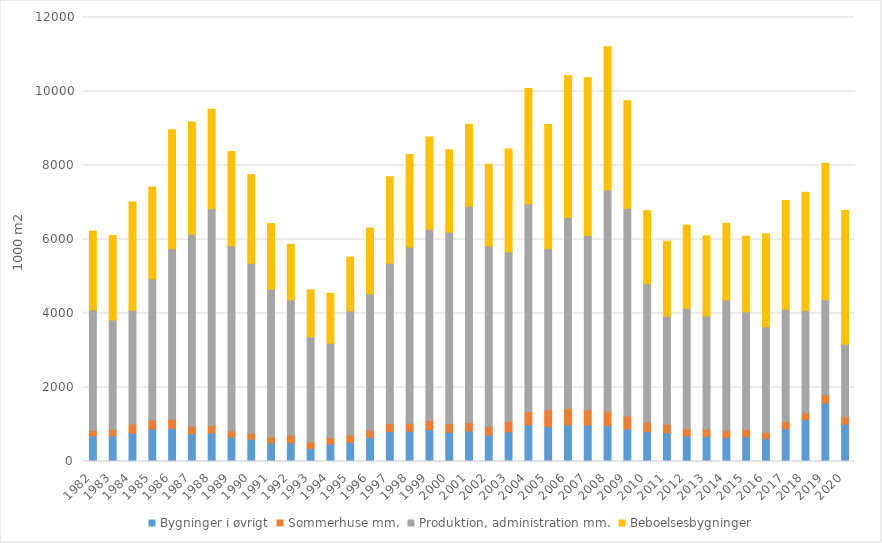
| Category | Bygninger i øvrigt | Sommerhuse mm. | Produktion, administration mm. | Beboelsesbygninger |
|---|---|---|---|---|
| 1982 | 689.438 | 156.497 | 3254.617 | 2129.288 |
| 1983 | 690.079 | 168.269 | 2964.675 | 2286.894 |
| 1984 | 768.984 | 247.712 | 3073.718 | 2922.97 |
| 1985 | 881.294 | 240.256 | 3811.789 | 2483.391 |
| 1986 | 891.343 | 250.771 | 4605.788 | 3218.41 |
| 1987 | 751.987 | 199.505 | 5189.478 | 3031.841 |
| 1988 | 770.067 | 206.254 | 5852.876 | 2693.13 |
| 1989 | 661.104 | 160.621 | 5010.111 | 2545.884 |
| 1990 | 603.764 | 160.306 | 4591.995 | 2393.059 |
| 1991 | 504.701 | 154.912 | 3999.038 | 1772.942 |
| 1992 | 505.573 | 207.339 | 3655.22 | 1499.718 |
| 1993 | 354.265 | 170.785 | 2848.022 | 1262.697 |
| 1994 | 469.464 | 171.508 | 2556.095 | 1346.93 |
| 1995 | 517.916 | 191.62 | 3363.987 | 1451.569 |
| 1996 | 652.891 | 194.465 | 3685.792 | 1779.159 |
| 1997 | 815.366 | 215.498 | 4324.652 | 2340.488 |
| 1998 | 817.867 | 218.728 | 4758.543 | 2501.158 |
| 1999 | 862.012 | 244.053 | 5172.074 | 2488.785 |
| 2000 | 788.834 | 229.935 | 5176.849 | 2231.897 |
| 2001 | 830.285 | 224.274 | 5847.444 | 2211.303 |
| 2002 | 719.689 | 221.138 | 4888.211 | 2205.794 |
| 2003 | 798.83 | 283.071 | 4587.634 | 2778.357 |
| 2004 | 991.62 | 361.765 | 5603.502 | 3125.521 |
| 2005 | 943.619 | 451.138 | 4358.054 | 3354.861 |
| 2006 | 992.533 | 448.18 | 5153.639 | 3839.444 |
| 2007 | 983.179 | 410.072 | 4711.834 | 4265.383 |
| 2008 | 970.877 | 384.825 | 5980.575 | 3874.791 |
| 2009 | 879.565 | 353.479 | 5612.986 | 2902.557 |
| 2010 | 806.208 | 252.285 | 3746.899 | 1974.08 |
| 2011 | 780.509 | 228.671 | 2916.521 | 2027.197 |
| 2012 | 689.103 | 194.194 | 3257.387 | 2248.641 |
| 2013 | 680.799 | 193.456 | 3057.255 | 2167.918 |
| 2014 | 651.76 | 183.963 | 3532.977 | 2065.072 |
| 2015 | 671.562 | 194.208 | 3179.586 | 2042.713 |
| 2016 | 618.425 | 171.485 | 2849.597 | 2513.037 |
| 2017 | 884.357 | 191.541 | 3041.891 | 2933.756 |
| 2018 | 1133.296 | 180.735 | 2766.67 | 3193.824 |
| 2019 | 1583.499 | 214.699 | 2578.758 | 3679.1 |
| 2020 | 1007.539 | 201.534 | 1956.828 | 3619.422 |